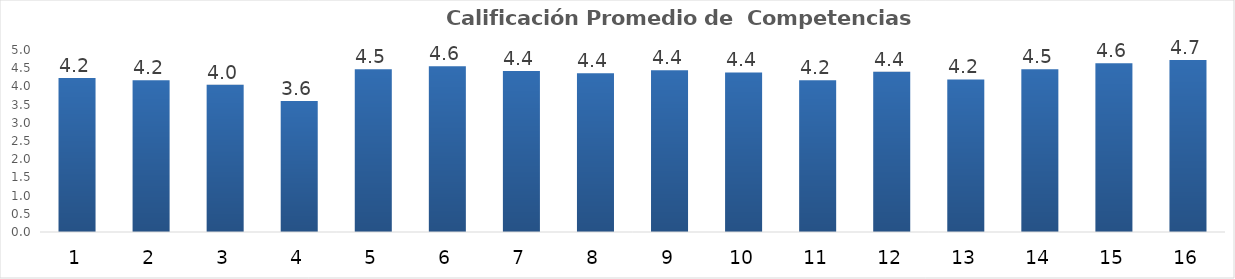
| Category | Series 0 |
|---|---|
| 0 | 4.234 |
| 1 | 4.17 |
| 2 | 4.043 |
| 3 | 3.596 |
| 4 | 4.468 |
| 5 | 4.553 |
| 6 | 4.426 |
| 7 | 4.362 |
| 8 | 4.447 |
| 9 | 4.383 |
| 10 | 4.17 |
| 11 | 4.404 |
| 12 | 4.191 |
| 13 | 4.468 |
| 14 | 4.638 |
| 15 | 4.723 |